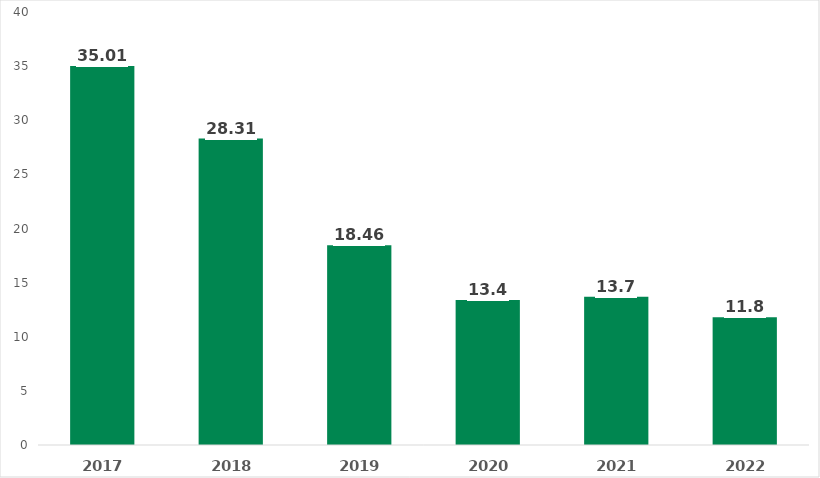
| Category | Waiting Time in days |
|---|---|
| 2017.0 | 35.01 |
| 2018.0 | 28.31 |
| 2019.0 | 18.46 |
| 2020.0 | 13.4 |
| 2021.0 | 13.7 |
| 2022.0 | 11.8 |